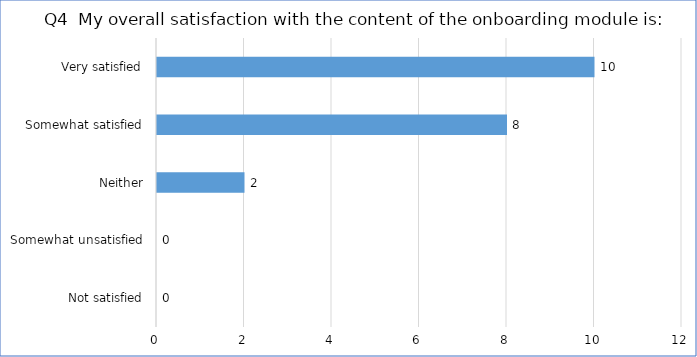
| Category | Series 0 |
|---|---|
| Not satisfied | 0 |
| Somewhat unsatisfied | 0 |
| Neither | 2 |
| Somewhat satisfied | 8 |
| Very satisfied | 10 |